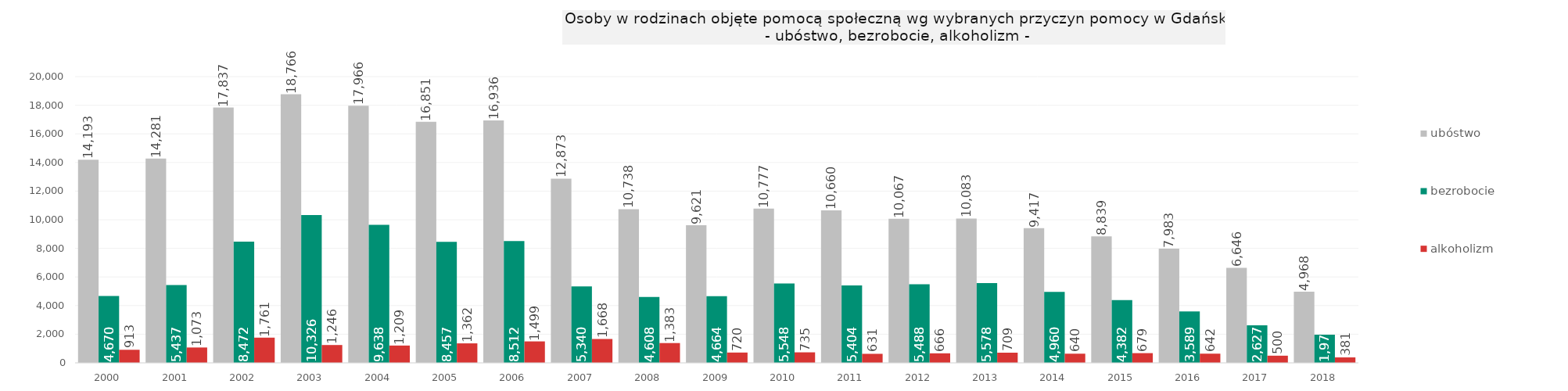
| Category | ubóstwo | bezrobocie | alkoholizm |
|---|---|---|---|
| 2000.0 | 14193 | 4670 | 913 |
| 2001.0 | 14281 | 5437 | 1073 |
| 2002.0 | 17837 | 8472 | 1761 |
| 2003.0 | 18766 | 10326 | 1246 |
| 2004.0 | 17966 | 9638 | 1209 |
| 2005.0 | 16851 | 8457 | 1362 |
| 2006.0 | 16936 | 8512 | 1499 |
| 2007.0 | 12873 | 5340 | 1668 |
| 2008.0 | 10738 | 4608 | 1383 |
| 2009.0 | 9621 | 4664 | 720 |
| 2010.0 | 10777 | 5548 | 735 |
| 2011.0 | 10660 | 5404 | 631 |
| 2012.0 | 10067 | 5488 | 666 |
| 2013.0 | 10083 | 5578 | 709 |
| 2014.0 | 9417 | 4960 | 640 |
| 2015.0 | 8839 | 4382 | 679 |
| 2016.0 | 7983 | 3589 | 642 |
| 2017.0 | 6646 | 2627 | 500 |
| 2018.0 | 4968 | 1971 | 381 |